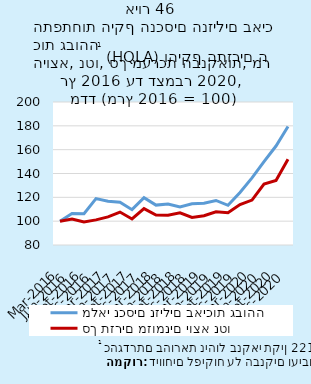
| Category | מלאי נכסים נזילים באיכות גבוהה | סך תזרים מזומנים יוצא נטו |
|---|---|---|
| 2016-03-31 | 100 | 100 |
| 2016-06-30 | 106.432 | 101.868 |
| 2016-09-30 | 106.264 | 99.368 |
| 2016-12-31 | 118.909 | 101.097 |
| 2017-03-31 | 116.676 | 103.611 |
| 2017-06-30 | 115.906 | 107.651 |
| 2017-09-30 | 109.664 | 101.82 |
| 2017-12-31 | 119.755 | 110.497 |
| 2018-03-31 | 113.491 | 105.186 |
| 2018-06-30 | 114.372 | 105.022 |
| 2018-09-30 | 111.904 | 106.976 |
| 2018-12-31 | 114.639 | 103.149 |
| 2019-03-31 | 115.027 | 104.592 |
| 2019-06-30 | 117.388 | 107.933 |
| 2019-09-30 | 113.279 | 107.074 |
| 2019-12-31 | 124.13 | 113.987 |
| 2020-03-31 | 136.332 | 117.736 |
| 2020-06-30 | 149.951 | 131.088 |
| 2020-09-30 | 163.054 | 134.19 |
| 2020-12-31 | 179.368 | 151.993 |